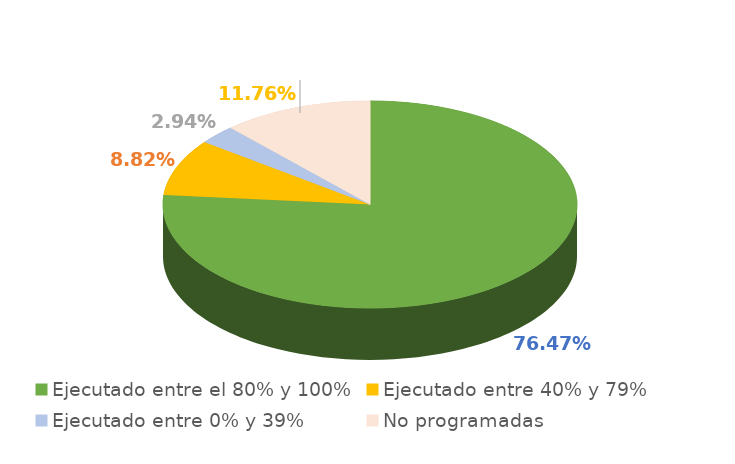
| Category | Series 0 |
|---|---|
| Ejecutado entre el 80% y 100% | 0.765 |
| Ejecutado entre 40% y 79% | 0.088 |
| Ejecutado entre 0% y 39% | 0.029 |
| No programadas | 0.118 |